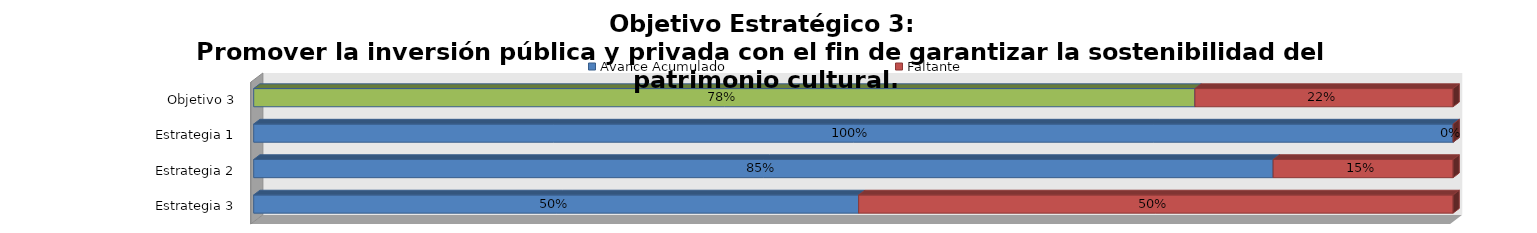
| Category | Avance Acumulado | Faltante |
|---|---|---|
| Estrategia 3 | 0.504 | 0.496 |
| Estrategia 2 | 0.85 | 0.15 |
| Estrategia 1 | 1 | 0 |
| Objetivo 3 | 0.785 | 0.215 |